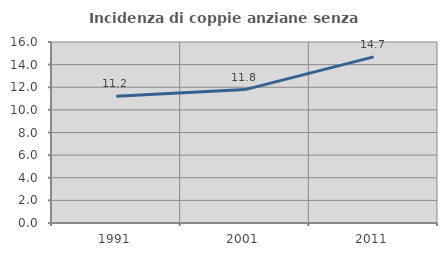
| Category | Incidenza di coppie anziane senza figli  |
|---|---|
| 1991.0 | 11.208 |
| 2001.0 | 11.791 |
| 2011.0 | 14.689 |